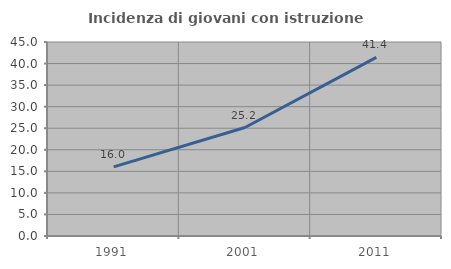
| Category | Incidenza di giovani con istruzione universitaria |
|---|---|
| 1991.0 | 16.045 |
| 2001.0 | 25.161 |
| 2011.0 | 41.42 |